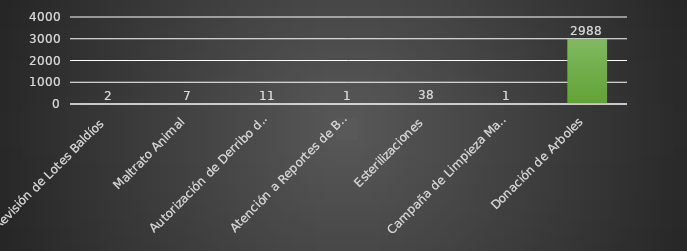
| Category | INDICADOR  |
|---|---|
| Revisión de Lotes Baldíos | 2 |
| Maltrato Animal | 7 |
| Autorización de Derribo de Arboles  | 11 |
| Atención a Reportes de Basureros clandestinos | 1 |
| Esterilizaciones | 38 |
| Campaña de Limpieza Masiva | 1 |
| Donación de Arboles | 2988 |